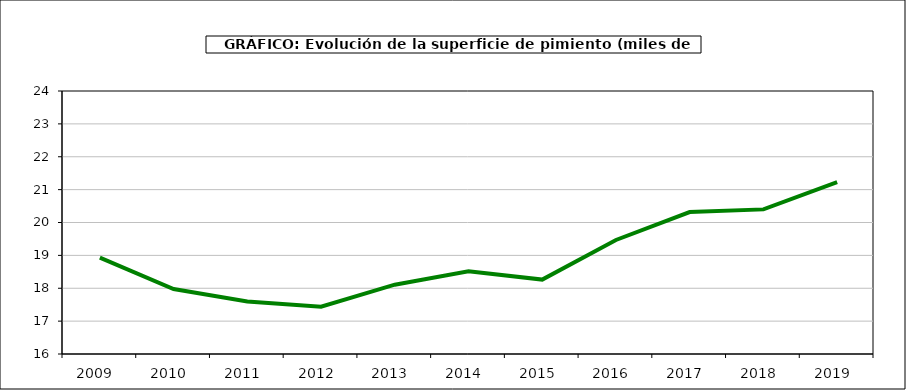
| Category | superficie |
|---|---|
| 2009.0 | 18.931 |
| 2010.0 | 17.975 |
| 2011.0 | 17.595 |
| 2012.0 | 17.44 |
| 2013.0 | 18.108 |
| 2014.0 | 18.513 |
| 2015.0 | 18.263 |
| 2016.0 | 19.468 |
| 2017.0 | 20.319 |
| 2018.0 | 20.399 |
| 2019.0 | 21.229 |